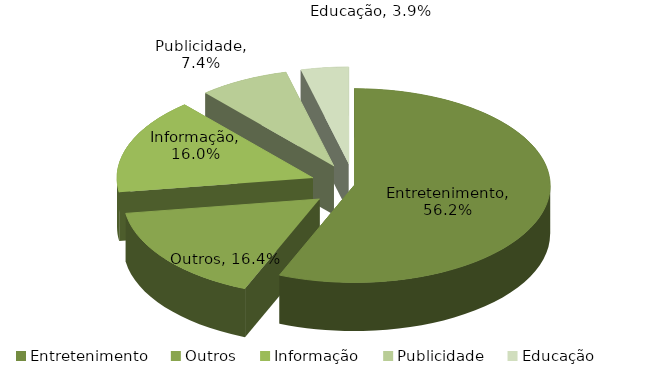
| Category | Series 0 |
|---|---|
| Entretenimento | 0.562 |
| Outros | 0.164 |
| Informação | 0.16 |
| Publicidade | 0.074 |
| Educação | 0.039 |